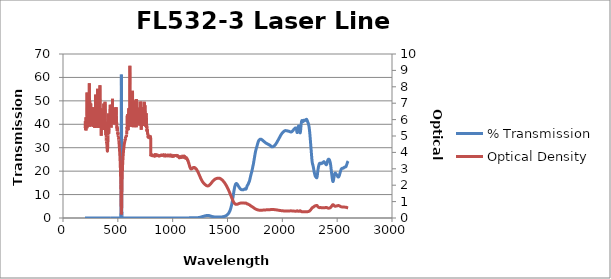
| Category | % Transmission |
|---|---|
| 2600.0 | 24.286 |
| 2599.0 | 24.215 |
| 2598.0 | 24.142 |
| 2597.0 | 24.055 |
| 2596.0 | 23.966 |
| 2595.0 | 23.859 |
| 2594.0 | 23.736 |
| 2593.0 | 23.604 |
| 2592.0 | 23.474 |
| 2591.0 | 23.342 |
| 2590.0 | 23.202 |
| 2589.0 | 23.065 |
| 2588.0 | 22.916 |
| 2587.0 | 22.777 |
| 2586.0 | 22.633 |
| 2585.0 | 22.502 |
| 2584.0 | 22.37 |
| 2583.0 | 22.226 |
| 2582.0 | 22.093 |
| 2581.0 | 21.995 |
| 2580.0 | 21.918 |
| 2579.0 | 21.86 |
| 2578.0 | 21.818 |
| 2577.0 | 21.786 |
| 2576.0 | 21.765 |
| 2575.0 | 21.761 |
| 2574.0 | 21.758 |
| 2573.0 | 21.751 |
| 2572.0 | 21.746 |
| 2571.0 | 21.74 |
| 2570.0 | 21.734 |
| 2569.0 | 21.72 |
| 2568.0 | 21.706 |
| 2567.0 | 21.686 |
| 2566.0 | 21.658 |
| 2565.0 | 21.623 |
| 2564.0 | 21.584 |
| 2563.0 | 21.539 |
| 2562.0 | 21.491 |
| 2561.0 | 21.448 |
| 2560.0 | 21.4 |
| 2559.0 | 21.361 |
| 2558.0 | 21.331 |
| 2557.0 | 21.311 |
| 2556.0 | 21.285 |
| 2555.0 | 21.271 |
| 2554.0 | 21.256 |
| 2553.0 | 21.247 |
| 2552.0 | 21.245 |
| 2551.0 | 21.244 |
| 2550.0 | 21.245 |
| 2549.0 | 21.244 |
| 2548.0 | 21.243 |
| 2547.0 | 21.237 |
| 2546.0 | 21.217 |
| 2545.0 | 21.2 |
| 2544.0 | 21.173 |
| 2543.0 | 21.134 |
| 2542.0 | 21.092 |
| 2541.0 | 21.052 |
| 2540.0 | 20.996 |
| 2539.0 | 20.935 |
| 2538.0 | 20.869 |
| 2537.0 | 20.794 |
| 2536.0 | 20.698 |
| 2535.0 | 20.59 |
| 2534.0 | 20.459 |
| 2533.0 | 20.317 |
| 2532.0 | 20.169 |
| 2531.0 | 20.012 |
| 2530.0 | 19.856 |
| 2529.0 | 19.701 |
| 2528.0 | 19.535 |
| 2527.0 | 19.372 |
| 2526.0 | 19.213 |
| 2525.0 | 19.052 |
| 2524.0 | 18.881 |
| 2523.0 | 18.72 |
| 2522.0 | 18.554 |
| 2521.0 | 18.399 |
| 2520.0 | 18.25 |
| 2519.0 | 18.115 |
| 2518.0 | 17.98 |
| 2517.0 | 17.861 |
| 2516.0 | 17.753 |
| 2515.0 | 17.659 |
| 2514.0 | 17.584 |
| 2513.0 | 17.535 |
| 2512.0 | 17.503 |
| 2511.0 | 17.485 |
| 2510.0 | 17.482 |
| 2509.0 | 17.501 |
| 2508.0 | 17.531 |
| 2507.0 | 17.571 |
| 2506.0 | 17.626 |
| 2505.0 | 17.694 |
| 2504.0 | 17.765 |
| 2503.0 | 17.844 |
| 2502.0 | 17.935 |
| 2501.0 | 18.023 |
| 2500.0 | 18.105 |
| 2499.0 | 18.186 |
| 2498.0 | 18.268 |
| 2497.0 | 18.338 |
| 2496.0 | 18.407 |
| 2495.0 | 18.477 |
| 2494.0 | 18.537 |
| 2493.0 | 18.592 |
| 2492.0 | 18.65 |
| 2491.0 | 18.706 |
| 2490.0 | 18.765 |
| 2489.0 | 18.822 |
| 2488.0 | 18.894 |
| 2487.0 | 18.959 |
| 2486.0 | 19.024 |
| 2485.0 | 19.081 |
| 2484.0 | 19.134 |
| 2483.0 | 19.162 |
| 2482.0 | 19.169 |
| 2481.0 | 19.149 |
| 2480.0 | 19.095 |
| 2479.0 | 19.004 |
| 2478.0 | 18.884 |
| 2477.0 | 18.732 |
| 2476.0 | 18.553 |
| 2475.0 | 18.352 |
| 2474.0 | 18.138 |
| 2473.0 | 17.909 |
| 2472.0 | 17.661 |
| 2471.0 | 17.403 |
| 2470.0 | 17.137 |
| 2469.0 | 16.861 |
| 2468.0 | 16.595 |
| 2467.0 | 16.331 |
| 2466.0 | 16.087 |
| 2465.0 | 15.866 |
| 2464.0 | 15.696 |
| 2463.0 | 15.582 |
| 2462.0 | 15.535 |
| 2461.0 | 15.562 |
| 2460.0 | 15.664 |
| 2459.0 | 15.836 |
| 2458.0 | 16.063 |
| 2457.0 | 16.35 |
| 2456.0 | 16.668 |
| 2455.0 | 16.993 |
| 2454.0 | 17.33 |
| 2453.0 | 17.688 |
| 2452.0 | 18.042 |
| 2451.0 | 18.419 |
| 2450.0 | 18.816 |
| 2449.0 | 19.208 |
| 2448.0 | 19.608 |
| 2447.0 | 20.025 |
| 2446.0 | 20.453 |
| 2445.0 | 20.874 |
| 2444.0 | 21.307 |
| 2443.0 | 21.728 |
| 2442.0 | 22.103 |
| 2441.0 | 22.475 |
| 2440.0 | 22.801 |
| 2439.0 | 23.103 |
| 2438.0 | 23.375 |
| 2437.0 | 23.623 |
| 2436.0 | 23.838 |
| 2435.0 | 24.023 |
| 2434.0 | 24.192 |
| 2433.0 | 24.34 |
| 2432.0 | 24.473 |
| 2431.0 | 24.595 |
| 2430.0 | 24.7 |
| 2429.0 | 24.792 |
| 2428.0 | 24.879 |
| 2427.0 | 24.953 |
| 2426.0 | 25.008 |
| 2425.0 | 25.056 |
| 2424.0 | 25.087 |
| 2423.0 | 25.095 |
| 2422.0 | 25.1 |
| 2421.0 | 25.086 |
| 2420.0 | 25.055 |
| 2419.0 | 25.021 |
| 2418.0 | 24.963 |
| 2417.0 | 24.891 |
| 2416.0 | 24.819 |
| 2415.0 | 24.716 |
| 2414.0 | 24.6 |
| 2413.0 | 24.471 |
| 2412.0 | 24.306 |
| 2411.0 | 24.136 |
| 2410.0 | 23.947 |
| 2409.0 | 23.754 |
| 2408.0 | 23.558 |
| 2407.0 | 23.362 |
| 2406.0 | 23.182 |
| 2405.0 | 23.023 |
| 2404.0 | 22.891 |
| 2403.0 | 22.801 |
| 2402.0 | 22.747 |
| 2401.0 | 22.725 |
| 2400.0 | 22.737 |
| 2399.0 | 22.773 |
| 2398.0 | 22.831 |
| 2397.0 | 22.895 |
| 2396.0 | 22.967 |
| 2395.0 | 23.048 |
| 2394.0 | 23.116 |
| 2393.0 | 23.188 |
| 2392.0 | 23.257 |
| 2391.0 | 23.32 |
| 2390.0 | 23.389 |
| 2389.0 | 23.456 |
| 2388.0 | 23.523 |
| 2387.0 | 23.6 |
| 2386.0 | 23.67 |
| 2385.0 | 23.748 |
| 2384.0 | 23.819 |
| 2383.0 | 23.879 |
| 2382.0 | 23.942 |
| 2381.0 | 23.985 |
| 2380.0 | 24.015 |
| 2379.0 | 24.032 |
| 2378.0 | 24.024 |
| 2377.0 | 23.996 |
| 2376.0 | 23.965 |
| 2375.0 | 23.906 |
| 2374.0 | 23.857 |
| 2373.0 | 23.791 |
| 2372.0 | 23.721 |
| 2371.0 | 23.667 |
| 2370.0 | 23.6 |
| 2369.0 | 23.549 |
| 2368.0 | 23.496 |
| 2367.0 | 23.446 |
| 2366.0 | 23.399 |
| 2365.0 | 23.374 |
| 2364.0 | 23.36 |
| 2363.0 | 23.365 |
| 2362.0 | 23.384 |
| 2361.0 | 23.412 |
| 2360.0 | 23.438 |
| 2359.0 | 23.45 |
| 2358.0 | 23.453 |
| 2357.0 | 23.431 |
| 2356.0 | 23.399 |
| 2355.0 | 23.343 |
| 2354.0 | 23.285 |
| 2353.0 | 23.222 |
| 2352.0 | 23.174 |
| 2351.0 | 23.142 |
| 2350.0 | 23.132 |
| 2349.0 | 23.143 |
| 2348.0 | 23.17 |
| 2347.0 | 23.212 |
| 2346.0 | 23.253 |
| 2345.0 | 23.291 |
| 2344.0 | 23.322 |
| 2343.0 | 23.344 |
| 2342.0 | 23.351 |
| 2341.0 | 23.346 |
| 2340.0 | 23.317 |
| 2339.0 | 23.262 |
| 2338.0 | 23.198 |
| 2337.0 | 23.1 |
| 2336.0 | 22.987 |
| 2335.0 | 22.847 |
| 2334.0 | 22.687 |
| 2333.0 | 22.502 |
| 2332.0 | 22.314 |
| 2331.0 | 22.106 |
| 2330.0 | 21.885 |
| 2329.0 | 21.659 |
| 2328.0 | 21.408 |
| 2327.0 | 21.138 |
| 2326.0 | 20.86 |
| 2325.0 | 20.544 |
| 2324.0 | 20.218 |
| 2323.0 | 19.845 |
| 2322.0 | 19.453 |
| 2321.0 | 19.03 |
| 2320.0 | 18.616 |
| 2319.0 | 18.234 |
| 2318.0 | 17.887 |
| 2317.0 | 17.598 |
| 2316.0 | 17.385 |
| 2315.0 | 17.236 |
| 2314.0 | 17.157 |
| 2313.0 | 17.137 |
| 2312.0 | 17.163 |
| 2311.0 | 17.22 |
| 2310.0 | 17.292 |
| 2309.0 | 17.372 |
| 2308.0 | 17.448 |
| 2307.0 | 17.511 |
| 2306.0 | 17.561 |
| 2305.0 | 17.6 |
| 2304.0 | 17.645 |
| 2303.0 | 17.689 |
| 2302.0 | 17.747 |
| 2301.0 | 17.831 |
| 2300.0 | 17.921 |
| 2299.0 | 18.049 |
| 2298.0 | 18.19 |
| 2297.0 | 18.353 |
| 2296.0 | 18.536 |
| 2295.0 | 18.733 |
| 2294.0 | 18.934 |
| 2293.0 | 19.14 |
| 2292.0 | 19.363 |
| 2291.0 | 19.582 |
| 2290.0 | 19.817 |
| 2289.0 | 20.072 |
| 2288.0 | 20.323 |
| 2287.0 | 20.584 |
| 2286.0 | 20.855 |
| 2285.0 | 21.125 |
| 2284.0 | 21.387 |
| 2283.0 | 21.655 |
| 2282.0 | 21.906 |
| 2281.0 | 22.126 |
| 2280.0 | 22.329 |
| 2279.0 | 22.512 |
| 2278.0 | 22.676 |
| 2277.0 | 22.836 |
| 2276.0 | 23.008 |
| 2275.0 | 23.201 |
| 2274.0 | 23.416 |
| 2273.0 | 23.69 |
| 2272.0 | 24.014 |
| 2271.0 | 24.4 |
| 2270.0 | 24.86 |
| 2269.0 | 25.366 |
| 2268.0 | 25.901 |
| 2267.0 | 26.466 |
| 2266.0 | 27.045 |
| 2265.0 | 27.63 |
| 2264.0 | 28.234 |
| 2263.0 | 28.856 |
| 2262.0 | 29.456 |
| 2261.0 | 30.047 |
| 2260.0 | 30.636 |
| 2259.0 | 31.23 |
| 2258.0 | 31.807 |
| 2257.0 | 32.426 |
| 2256.0 | 33.023 |
| 2255.0 | 33.597 |
| 2254.0 | 34.18 |
| 2253.0 | 34.742 |
| 2252.0 | 35.284 |
| 2251.0 | 35.826 |
| 2250.0 | 36.346 |
| 2249.0 | 36.825 |
| 2248.0 | 37.276 |
| 2247.0 | 37.699 |
| 2246.0 | 38.093 |
| 2245.0 | 38.454 |
| 2244.0 | 38.798 |
| 2243.0 | 39.099 |
| 2242.0 | 39.369 |
| 2241.0 | 39.609 |
| 2240.0 | 39.823 |
| 2239.0 | 40.01 |
| 2238.0 | 40.178 |
| 2237.0 | 40.326 |
| 2236.0 | 40.453 |
| 2235.0 | 40.574 |
| 2234.0 | 40.681 |
| 2233.0 | 40.796 |
| 2232.0 | 40.908 |
| 2231.0 | 41.035 |
| 2230.0 | 41.161 |
| 2229.0 | 41.291 |
| 2228.0 | 41.435 |
| 2227.0 | 41.564 |
| 2226.0 | 41.692 |
| 2225.0 | 41.817 |
| 2224.0 | 41.914 |
| 2223.0 | 41.998 |
| 2222.0 | 42.066 |
| 2221.0 | 42.101 |
| 2220.0 | 42.121 |
| 2219.0 | 42.121 |
| 2218.0 | 42.094 |
| 2217.0 | 42.059 |
| 2216.0 | 42.012 |
| 2215.0 | 41.948 |
| 2214.0 | 41.894 |
| 2213.0 | 41.826 |
| 2212.0 | 41.77 |
| 2211.0 | 41.725 |
| 2210.0 | 41.676 |
| 2209.0 | 41.66 |
| 2208.0 | 41.647 |
| 2207.0 | 41.642 |
| 2206.0 | 41.661 |
| 2205.0 | 41.674 |
| 2204.0 | 41.691 |
| 2203.0 | 41.729 |
| 2202.0 | 41.744 |
| 2201.0 | 41.764 |
| 2200.0 | 41.777 |
| 2199.0 | 41.763 |
| 2198.0 | 41.749 |
| 2197.0 | 41.703 |
| 2196.0 | 41.644 |
| 2195.0 | 41.577 |
| 2194.0 | 41.483 |
| 2193.0 | 41.398 |
| 2192.0 | 41.314 |
| 2191.0 | 41.24 |
| 2190.0 | 41.194 |
| 2189.0 | 41.173 |
| 2188.0 | 41.175 |
| 2187.0 | 41.22 |
| 2186.0 | 41.277 |
| 2185.0 | 41.356 |
| 2184.0 | 41.443 |
| 2183.0 | 41.512 |
| 2182.0 | 41.573 |
| 2181.0 | 41.614 |
| 2180.0 | 41.623 |
| 2179.0 | 41.602 |
| 2178.0 | 41.547 |
| 2177.0 | 41.452 |
| 2176.0 | 41.308 |
| 2175.0 | 41.12 |
| 2174.0 | 40.869 |
| 2173.0 | 40.552 |
| 2172.0 | 40.17 |
| 2171.0 | 39.726 |
| 2170.0 | 39.226 |
| 2169.0 | 38.675 |
| 2168.0 | 38.137 |
| 2167.0 | 37.592 |
| 2166.0 | 37.112 |
| 2165.0 | 36.749 |
| 2164.0 | 36.482 |
| 2163.0 | 36.353 |
| 2162.0 | 36.343 |
| 2161.0 | 36.455 |
| 2160.0 | 36.669 |
| 2159.0 | 36.955 |
| 2158.0 | 37.27 |
| 2157.0 | 37.623 |
| 2156.0 | 37.973 |
| 2155.0 | 38.303 |
| 2154.0 | 38.615 |
| 2153.0 | 38.867 |
| 2152.0 | 39.066 |
| 2151.0 | 39.209 |
| 2150.0 | 39.29 |
| 2149.0 | 39.317 |
| 2148.0 | 39.274 |
| 2147.0 | 39.177 |
| 2146.0 | 39.027 |
| 2145.0 | 38.819 |
| 2144.0 | 38.575 |
| 2143.0 | 38.288 |
| 2142.0 | 37.982 |
| 2141.0 | 37.646 |
| 2140.0 | 37.318 |
| 2139.0 | 37.031 |
| 2138.0 | 36.777 |
| 2137.0 | 36.585 |
| 2136.0 | 36.48 |
| 2135.0 | 36.463 |
| 2134.0 | 36.536 |
| 2133.0 | 36.706 |
| 2132.0 | 36.919 |
| 2131.0 | 37.183 |
| 2130.0 | 37.455 |
| 2129.0 | 37.712 |
| 2128.0 | 37.951 |
| 2127.0 | 38.133 |
| 2126.0 | 38.267 |
| 2125.0 | 38.357 |
| 2124.0 | 38.408 |
| 2123.0 | 38.429 |
| 2122.0 | 38.434 |
| 2121.0 | 38.428 |
| 2120.0 | 38.416 |
| 2119.0 | 38.398 |
| 2118.0 | 38.386 |
| 2117.0 | 38.363 |
| 2116.0 | 38.337 |
| 2115.0 | 38.301 |
| 2114.0 | 38.259 |
| 2113.0 | 38.212 |
| 2112.0 | 38.161 |
| 2111.0 | 38.111 |
| 2110.0 | 38.061 |
| 2109.0 | 38.011 |
| 2108.0 | 37.962 |
| 2107.0 | 37.914 |
| 2106.0 | 37.866 |
| 2105.0 | 37.818 |
| 2104.0 | 37.766 |
| 2103.0 | 37.706 |
| 2102.0 | 37.65 |
| 2101.0 | 37.587 |
| 2100.0 | 37.52 |
| 2099.0 | 37.459 |
| 2098.0 | 37.39 |
| 2097.0 | 37.325 |
| 2096.0 | 37.258 |
| 2095.0 | 37.202 |
| 2094.0 | 37.15 |
| 2093.0 | 37.092 |
| 2092.0 | 37.053 |
| 2091.0 | 37.011 |
| 2090.0 | 36.969 |
| 2089.0 | 36.934 |
| 2088.0 | 36.896 |
| 2087.0 | 36.864 |
| 2086.0 | 36.828 |
| 2085.0 | 36.803 |
| 2084.0 | 36.776 |
| 2083.0 | 36.747 |
| 2082.0 | 36.733 |
| 2081.0 | 36.712 |
| 2080.0 | 36.703 |
| 2079.0 | 36.705 |
| 2078.0 | 36.704 |
| 2077.0 | 36.711 |
| 2076.0 | 36.724 |
| 2075.0 | 36.741 |
| 2074.0 | 36.757 |
| 2073.0 | 36.773 |
| 2072.0 | 36.796 |
| 2071.0 | 36.809 |
| 2070.0 | 36.826 |
| 2069.0 | 36.84 |
| 2068.0 | 36.858 |
| 2067.0 | 36.869 |
| 2066.0 | 36.881 |
| 2065.0 | 36.901 |
| 2064.0 | 36.921 |
| 2063.0 | 36.938 |
| 2062.0 | 36.962 |
| 2061.0 | 36.983 |
| 2060.0 | 37.007 |
| 2059.0 | 37.028 |
| 2058.0 | 37.045 |
| 2057.0 | 37.064 |
| 2056.0 | 37.073 |
| 2055.0 | 37.084 |
| 2054.0 | 37.09 |
| 2053.0 | 37.093 |
| 2052.0 | 37.097 |
| 2051.0 | 37.104 |
| 2050.0 | 37.115 |
| 2049.0 | 37.126 |
| 2048.0 | 37.138 |
| 2047.0 | 37.147 |
| 2046.0 | 37.167 |
| 2045.0 | 37.18 |
| 2044.0 | 37.193 |
| 2043.0 | 37.207 |
| 2042.0 | 37.218 |
| 2041.0 | 37.227 |
| 2040.0 | 37.231 |
| 2039.0 | 37.239 |
| 2038.0 | 37.246 |
| 2037.0 | 37.246 |
| 2036.0 | 37.258 |
| 2035.0 | 37.261 |
| 2034.0 | 37.271 |
| 2033.0 | 37.281 |
| 2032.0 | 37.291 |
| 2031.0 | 37.304 |
| 2030.0 | 37.303 |
| 2029.0 | 37.308 |
| 2028.0 | 37.301 |
| 2027.0 | 37.297 |
| 2026.0 | 37.279 |
| 2025.0 | 37.265 |
| 2024.0 | 37.246 |
| 2023.0 | 37.217 |
| 2022.0 | 37.194 |
| 2021.0 | 37.166 |
| 2020.0 | 37.151 |
| 2019.0 | 37.12 |
| 2018.0 | 37.09 |
| 2017.0 | 37.064 |
| 2016.0 | 37.041 |
| 2015.0 | 37.014 |
| 2014.0 | 36.976 |
| 2013.0 | 36.937 |
| 2012.0 | 36.898 |
| 2011.0 | 36.855 |
| 2010.0 | 36.805 |
| 2009.0 | 36.761 |
| 2008.0 | 36.712 |
| 2007.0 | 36.661 |
| 2006.0 | 36.616 |
| 2005.0 | 36.574 |
| 2004.0 | 36.535 |
| 2003.0 | 36.487 |
| 2002.0 | 36.437 |
| 2001.0 | 36.392 |
| 2000.0 | 36.338 |
| 1999.0 | 36.29 |
| 1998.0 | 36.22 |
| 1997.0 | 36.154 |
| 1996.0 | 36.088 |
| 1995.0 | 36.006 |
| 1994.0 | 35.934 |
| 1993.0 | 35.856 |
| 1992.0 | 35.794 |
| 1991.0 | 35.727 |
| 1990.0 | 35.66 |
| 1989.0 | 35.588 |
| 1988.0 | 35.522 |
| 1987.0 | 35.46 |
| 1986.0 | 35.378 |
| 1985.0 | 35.297 |
| 1984.0 | 35.209 |
| 1983.0 | 35.128 |
| 1982.0 | 35.036 |
| 1981.0 | 34.939 |
| 1980.0 | 34.842 |
| 1979.0 | 34.752 |
| 1978.0 | 34.666 |
| 1977.0 | 34.58 |
| 1976.0 | 34.489 |
| 1975.0 | 34.411 |
| 1974.0 | 34.331 |
| 1973.0 | 34.244 |
| 1972.0 | 34.155 |
| 1971.0 | 34.062 |
| 1970.0 | 33.972 |
| 1969.0 | 33.888 |
| 1968.0 | 33.79 |
| 1967.0 | 33.692 |
| 1966.0 | 33.6 |
| 1965.0 | 33.518 |
| 1964.0 | 33.437 |
| 1963.0 | 33.355 |
| 1962.0 | 33.273 |
| 1961.0 | 33.19 |
| 1960.0 | 33.118 |
| 1959.0 | 33.046 |
| 1958.0 | 32.961 |
| 1957.0 | 32.868 |
| 1956.0 | 32.789 |
| 1955.0 | 32.7 |
| 1954.0 | 32.613 |
| 1953.0 | 32.517 |
| 1952.0 | 32.433 |
| 1951.0 | 32.356 |
| 1950.0 | 32.288 |
| 1949.0 | 32.21 |
| 1948.0 | 32.131 |
| 1947.0 | 32.059 |
| 1946.0 | 31.992 |
| 1945.0 | 31.925 |
| 1944.0 | 31.845 |
| 1943.0 | 31.763 |
| 1942.0 | 31.677 |
| 1941.0 | 31.601 |
| 1940.0 | 31.528 |
| 1939.0 | 31.451 |
| 1938.0 | 31.378 |
| 1937.0 | 31.314 |
| 1936.0 | 31.268 |
| 1935.0 | 31.218 |
| 1934.0 | 31.17 |
| 1933.0 | 31.119 |
| 1932.0 | 31.066 |
| 1931.0 | 31.012 |
| 1930.0 | 30.967 |
| 1929.0 | 30.909 |
| 1928.0 | 30.856 |
| 1927.0 | 30.794 |
| 1926.0 | 30.75 |
| 1925.0 | 30.707 |
| 1924.0 | 30.688 |
| 1923.0 | 30.657 |
| 1922.0 | 30.621 |
| 1921.0 | 30.578 |
| 1920.0 | 30.549 |
| 1919.0 | 30.522 |
| 1918.0 | 30.504 |
| 1917.0 | 30.487 |
| 1916.0 | 30.457 |
| 1915.0 | 30.421 |
| 1914.0 | 30.395 |
| 1913.0 | 30.373 |
| 1912.0 | 30.365 |
| 1911.0 | 30.36 |
| 1910.0 | 30.361 |
| 1909.0 | 30.357 |
| 1908.0 | 30.364 |
| 1907.0 | 30.369 |
| 1906.0 | 30.38 |
| 1905.0 | 30.375 |
| 1904.0 | 30.378 |
| 1903.0 | 30.387 |
| 1902.0 | 30.41 |
| 1901.0 | 30.443 |
| 1900.0 | 30.477 |
| 1899.0 | 30.528 |
| 1898.0 | 30.566 |
| 1897.0 | 30.615 |
| 1896.0 | 30.651 |
| 1895.0 | 30.698 |
| 1894.0 | 30.748 |
| 1893.0 | 30.792 |
| 1892.0 | 30.828 |
| 1891.0 | 30.871 |
| 1890.0 | 30.91 |
| 1889.0 | 30.952 |
| 1888.0 | 30.99 |
| 1887.0 | 31.032 |
| 1886.0 | 31.068 |
| 1885.0 | 31.1 |
| 1884.0 | 31.124 |
| 1883.0 | 31.156 |
| 1882.0 | 31.188 |
| 1881.0 | 31.229 |
| 1880.0 | 31.253 |
| 1879.0 | 31.258 |
| 1878.0 | 31.264 |
| 1877.0 | 31.271 |
| 1876.0 | 31.302 |
| 1875.0 | 31.339 |
| 1874.0 | 31.377 |
| 1873.0 | 31.411 |
| 1872.0 | 31.438 |
| 1871.0 | 31.462 |
| 1870.0 | 31.492 |
| 1869.0 | 31.511 |
| 1868.0 | 31.54 |
| 1867.0 | 31.558 |
| 1866.0 | 31.572 |
| 1865.0 | 31.589 |
| 1864.0 | 31.611 |
| 1863.0 | 31.636 |
| 1862.0 | 31.66 |
| 1861.0 | 31.679 |
| 1860.0 | 31.712 |
| 1859.0 | 31.741 |
| 1858.0 | 31.785 |
| 1857.0 | 31.821 |
| 1856.0 | 31.857 |
| 1855.0 | 31.874 |
| 1854.0 | 31.884 |
| 1853.0 | 31.905 |
| 1852.0 | 31.938 |
| 1851.0 | 31.972 |
| 1850.0 | 32.004 |
| 1849.0 | 32.038 |
| 1848.0 | 32.083 |
| 1847.0 | 32.13 |
| 1846.0 | 32.169 |
| 1845.0 | 32.206 |
| 1844.0 | 32.233 |
| 1843.0 | 32.266 |
| 1842.0 | 32.302 |
| 1841.0 | 32.339 |
| 1840.0 | 32.387 |
| 1839.0 | 32.432 |
| 1838.0 | 32.466 |
| 1837.0 | 32.494 |
| 1836.0 | 32.516 |
| 1835.0 | 32.554 |
| 1834.0 | 32.598 |
| 1833.0 | 32.65 |
| 1832.0 | 32.703 |
| 1831.0 | 32.75 |
| 1830.0 | 32.792 |
| 1829.0 | 32.82 |
| 1828.0 | 32.84 |
| 1827.0 | 32.858 |
| 1826.0 | 32.892 |
| 1825.0 | 32.946 |
| 1824.0 | 33.001 |
| 1823.0 | 33.052 |
| 1822.0 | 33.096 |
| 1821.0 | 33.159 |
| 1820.0 | 33.21 |
| 1819.0 | 33.248 |
| 1818.0 | 33.275 |
| 1817.0 | 33.311 |
| 1816.0 | 33.34 |
| 1815.0 | 33.371 |
| 1814.0 | 33.409 |
| 1813.0 | 33.436 |
| 1812.0 | 33.47 |
| 1811.0 | 33.496 |
| 1810.0 | 33.525 |
| 1809.0 | 33.554 |
| 1808.0 | 33.578 |
| 1807.0 | 33.595 |
| 1806.0 | 33.605 |
| 1805.0 | 33.615 |
| 1804.0 | 33.615 |
| 1803.0 | 33.627 |
| 1802.0 | 33.627 |
| 1801.0 | 33.638 |
| 1800.0 | 33.643 |
| 1799.0 | 33.638 |
| 1798.0 | 33.635 |
| 1797.0 | 33.612 |
| 1796.0 | 33.596 |
| 1795.0 | 33.555 |
| 1794.0 | 33.522 |
| 1793.0 | 33.481 |
| 1792.0 | 33.435 |
| 1791.0 | 33.401 |
| 1790.0 | 33.349 |
| 1789.0 | 33.305 |
| 1788.0 | 33.249 |
| 1787.0 | 33.184 |
| 1786.0 | 33.117 |
| 1785.0 | 33.03 |
| 1784.0 | 32.944 |
| 1783.0 | 32.838 |
| 1782.0 | 32.727 |
| 1781.0 | 32.608 |
| 1780.0 | 32.487 |
| 1779.0 | 32.358 |
| 1778.0 | 32.216 |
| 1777.0 | 32.072 |
| 1776.0 | 31.919 |
| 1775.0 | 31.754 |
| 1774.0 | 31.58 |
| 1773.0 | 31.405 |
| 1772.0 | 31.222 |
| 1771.0 | 31.042 |
| 1770.0 | 30.874 |
| 1769.0 | 30.704 |
| 1768.0 | 30.539 |
| 1767.0 | 30.386 |
| 1766.0 | 30.238 |
| 1765.0 | 30.087 |
| 1764.0 | 29.933 |
| 1763.0 | 29.767 |
| 1762.0 | 29.589 |
| 1761.0 | 29.411 |
| 1760.0 | 29.233 |
| 1759.0 | 29.044 |
| 1758.0 | 28.85 |
| 1757.0 | 28.651 |
| 1756.0 | 28.439 |
| 1755.0 | 28.211 |
| 1754.0 | 27.983 |
| 1753.0 | 27.74 |
| 1752.0 | 27.474 |
| 1751.0 | 27.222 |
| 1750.0 | 26.946 |
| 1749.0 | 26.665 |
| 1748.0 | 26.394 |
| 1747.0 | 26.117 |
| 1746.0 | 25.837 |
| 1745.0 | 25.545 |
| 1744.0 | 25.256 |
| 1743.0 | 24.953 |
| 1742.0 | 24.651 |
| 1741.0 | 24.371 |
| 1740.0 | 24.084 |
| 1739.0 | 23.816 |
| 1738.0 | 23.554 |
| 1737.0 | 23.29 |
| 1736.0 | 23.043 |
| 1735.0 | 22.809 |
| 1734.0 | 22.581 |
| 1733.0 | 22.361 |
| 1732.0 | 22.147 |
| 1731.0 | 21.927 |
| 1730.0 | 21.707 |
| 1729.0 | 21.487 |
| 1728.0 | 21.268 |
| 1727.0 | 21.039 |
| 1726.0 | 20.81 |
| 1725.0 | 20.589 |
| 1724.0 | 20.352 |
| 1723.0 | 20.127 |
| 1722.0 | 19.932 |
| 1721.0 | 19.73 |
| 1720.0 | 19.542 |
| 1719.0 | 19.359 |
| 1718.0 | 19.188 |
| 1717.0 | 19.014 |
| 1716.0 | 18.846 |
| 1715.0 | 18.682 |
| 1714.0 | 18.511 |
| 1713.0 | 18.328 |
| 1712.0 | 18.141 |
| 1711.0 | 17.94 |
| 1710.0 | 17.739 |
| 1709.0 | 17.533 |
| 1708.0 | 17.324 |
| 1707.0 | 17.11 |
| 1706.0 | 16.913 |
| 1705.0 | 16.699 |
| 1704.0 | 16.492 |
| 1703.0 | 16.294 |
| 1702.0 | 16.104 |
| 1701.0 | 15.927 |
| 1700.0 | 15.768 |
| 1699.0 | 15.629 |
| 1698.0 | 15.517 |
| 1697.0 | 15.416 |
| 1696.0 | 15.325 |
| 1695.0 | 15.231 |
| 1694.0 | 15.125 |
| 1693.0 | 15 |
| 1692.0 | 14.861 |
| 1691.0 | 14.716 |
| 1690.0 | 14.58 |
| 1689.0 | 14.457 |
| 1688.0 | 14.353 |
| 1687.0 | 14.273 |
| 1686.0 | 14.206 |
| 1685.0 | 14.154 |
| 1684.0 | 14.112 |
| 1683.0 | 14.059 |
| 1682.0 | 14 |
| 1681.0 | 13.924 |
| 1680.0 | 13.828 |
| 1679.0 | 13.707 |
| 1678.0 | 13.562 |
| 1677.0 | 13.418 |
| 1676.0 | 13.254 |
| 1675.0 | 13.094 |
| 1674.0 | 12.926 |
| 1673.0 | 12.775 |
| 1672.0 | 12.637 |
| 1671.0 | 12.521 |
| 1670.0 | 12.422 |
| 1669.0 | 12.351 |
| 1668.0 | 12.31 |
| 1667.0 | 12.297 |
| 1666.0 | 12.301 |
| 1665.0 | 12.324 |
| 1664.0 | 12.358 |
| 1663.0 | 12.387 |
| 1662.0 | 12.415 |
| 1661.0 | 12.436 |
| 1660.0 | 12.447 |
| 1659.0 | 12.445 |
| 1658.0 | 12.442 |
| 1657.0 | 12.427 |
| 1656.0 | 12.403 |
| 1655.0 | 12.377 |
| 1654.0 | 12.346 |
| 1653.0 | 12.311 |
| 1652.0 | 12.276 |
| 1651.0 | 12.236 |
| 1650.0 | 12.198 |
| 1649.0 | 12.163 |
| 1648.0 | 12.131 |
| 1647.0 | 12.105 |
| 1646.0 | 12.087 |
| 1645.0 | 12.079 |
| 1644.0 | 12.066 |
| 1643.0 | 12.068 |
| 1642.0 | 12.067 |
| 1641.0 | 12.064 |
| 1640.0 | 12.057 |
| 1639.0 | 12.052 |
| 1638.0 | 12.043 |
| 1637.0 | 12.032 |
| 1636.0 | 12.023 |
| 1635.0 | 12.021 |
| 1634.0 | 12.018 |
| 1633.0 | 12.027 |
| 1632.0 | 12.035 |
| 1631.0 | 12.051 |
| 1630.0 | 12.067 |
| 1629.0 | 12.085 |
| 1628.0 | 12.095 |
| 1627.0 | 12.117 |
| 1626.0 | 12.14 |
| 1625.0 | 12.162 |
| 1624.0 | 12.184 |
| 1623.0 | 12.209 |
| 1622.0 | 12.237 |
| 1621.0 | 12.268 |
| 1620.0 | 12.303 |
| 1619.0 | 12.339 |
| 1618.0 | 12.377 |
| 1617.0 | 12.424 |
| 1616.0 | 12.467 |
| 1615.0 | 12.521 |
| 1614.0 | 12.583 |
| 1613.0 | 12.64 |
| 1612.0 | 12.703 |
| 1611.0 | 12.763 |
| 1610.0 | 12.822 |
| 1609.0 | 12.884 |
| 1608.0 | 12.955 |
| 1607.0 | 13.019 |
| 1606.0 | 13.089 |
| 1605.0 | 13.165 |
| 1604.0 | 13.241 |
| 1603.0 | 13.315 |
| 1602.0 | 13.401 |
| 1601.0 | 13.476 |
| 1600.0 | 13.555 |
| 1599.0 | 13.632 |
| 1598.0 | 13.713 |
| 1597.0 | 13.794 |
| 1596.0 | 13.878 |
| 1595.0 | 13.965 |
| 1594.0 | 14.039 |
| 1593.0 | 14.12 |
| 1592.0 | 14.194 |
| 1591.0 | 14.266 |
| 1590.0 | 14.333 |
| 1589.0 | 14.399 |
| 1588.0 | 14.461 |
| 1587.0 | 14.516 |
| 1586.0 | 14.573 |
| 1585.0 | 14.619 |
| 1584.0 | 14.653 |
| 1583.0 | 14.68 |
| 1582.0 | 14.697 |
| 1581.0 | 14.708 |
| 1580.0 | 14.702 |
| 1579.0 | 14.695 |
| 1578.0 | 14.676 |
| 1577.0 | 14.639 |
| 1576.0 | 14.589 |
| 1575.0 | 14.528 |
| 1574.0 | 14.446 |
| 1573.0 | 14.352 |
| 1572.0 | 14.245 |
| 1571.0 | 14.12 |
| 1570.0 | 13.98 |
| 1569.0 | 13.826 |
| 1568.0 | 13.664 |
| 1567.0 | 13.48 |
| 1566.0 | 13.283 |
| 1565.0 | 13.072 |
| 1564.0 | 12.84 |
| 1563.0 | 12.597 |
| 1562.0 | 12.352 |
| 1561.0 | 12.099 |
| 1560.0 | 11.833 |
| 1559.0 | 11.558 |
| 1558.0 | 11.273 |
| 1557.0 | 10.969 |
| 1556.0 | 10.68 |
| 1555.0 | 10.378 |
| 1554.0 | 10.078 |
| 1553.0 | 9.776 |
| 1552.0 | 9.479 |
| 1551.0 | 9.171 |
| 1550.0 | 8.865 |
| 1549.0 | 8.582 |
| 1548.0 | 8.283 |
| 1547.0 | 7.994 |
| 1546.0 | 7.718 |
| 1545.0 | 7.432 |
| 1544.0 | 7.163 |
| 1543.0 | 6.899 |
| 1542.0 | 6.652 |
| 1541.0 | 6.404 |
| 1540.0 | 6.171 |
| 1539.0 | 5.936 |
| 1538.0 | 5.705 |
| 1537.0 | 5.489 |
| 1536.0 | 5.284 |
| 1535.0 | 5.089 |
| 1534.0 | 4.89 |
| 1533.0 | 4.71 |
| 1532.0 | 4.526 |
| 1531.0 | 4.35 |
| 1530.0 | 4.194 |
| 1529.0 | 4.034 |
| 1528.0 | 3.883 |
| 1527.0 | 3.738 |
| 1526.0 | 3.596 |
| 1525.0 | 3.461 |
| 1524.0 | 3.333 |
| 1523.0 | 3.21 |
| 1522.0 | 3.094 |
| 1521.0 | 2.979 |
| 1520.0 | 2.874 |
| 1519.0 | 2.768 |
| 1518.0 | 2.669 |
| 1517.0 | 2.572 |
| 1516.0 | 2.482 |
| 1515.0 | 2.394 |
| 1514.0 | 2.31 |
| 1513.0 | 2.23 |
| 1512.0 | 2.151 |
| 1511.0 | 2.079 |
| 1510.0 | 2.007 |
| 1509.0 | 1.942 |
| 1508.0 | 1.877 |
| 1507.0 | 1.816 |
| 1506.0 | 1.754 |
| 1505.0 | 1.697 |
| 1504.0 | 1.645 |
| 1503.0 | 1.589 |
| 1502.0 | 1.54 |
| 1501.0 | 1.494 |
| 1500.0 | 1.445 |
| 1499.0 | 1.399 |
| 1498.0 | 1.36 |
| 1497.0 | 1.321 |
| 1496.0 | 1.283 |
| 1495.0 | 1.244 |
| 1494.0 | 1.209 |
| 1493.0 | 1.173 |
| 1492.0 | 1.14 |
| 1491.0 | 1.108 |
| 1490.0 | 1.076 |
| 1489.0 | 1.049 |
| 1488.0 | 1.02 |
| 1487.0 | 0.993 |
| 1486.0 | 0.968 |
| 1485.0 | 0.944 |
| 1484.0 | 0.92 |
| 1483.0 | 0.897 |
| 1482.0 | 0.874 |
| 1481.0 | 0.851 |
| 1480.0 | 0.833 |
| 1479.0 | 0.811 |
| 1478.0 | 0.794 |
| 1477.0 | 0.775 |
| 1476.0 | 0.758 |
| 1475.0 | 0.741 |
| 1474.0 | 0.724 |
| 1473.0 | 0.71 |
| 1472.0 | 0.696 |
| 1471.0 | 0.68 |
| 1470.0 | 0.664 |
| 1469.0 | 0.652 |
| 1468.0 | 0.641 |
| 1467.0 | 0.629 |
| 1466.0 | 0.615 |
| 1465.0 | 0.603 |
| 1464.0 | 0.595 |
| 1463.0 | 0.582 |
| 1462.0 | 0.572 |
| 1461.0 | 0.562 |
| 1460.0 | 0.552 |
| 1459.0 | 0.542 |
| 1458.0 | 0.531 |
| 1457.0 | 0.526 |
| 1456.0 | 0.517 |
| 1455.0 | 0.51 |
| 1454.0 | 0.501 |
| 1453.0 | 0.496 |
| 1452.0 | 0.486 |
| 1451.0 | 0.48 |
| 1450.0 | 0.471 |
| 1449.0 | 0.465 |
| 1448.0 | 0.459 |
| 1447.0 | 0.456 |
| 1446.0 | 0.45 |
| 1445.0 | 0.442 |
| 1444.0 | 0.436 |
| 1443.0 | 0.434 |
| 1442.0 | 0.426 |
| 1441.0 | 0.424 |
| 1440.0 | 0.422 |
| 1439.0 | 0.415 |
| 1438.0 | 0.411 |
| 1437.0 | 0.406 |
| 1436.0 | 0.4 |
| 1435.0 | 0.4 |
| 1434.0 | 0.395 |
| 1433.0 | 0.391 |
| 1432.0 | 0.39 |
| 1431.0 | 0.388 |
| 1430.0 | 0.381 |
| 1429.0 | 0.382 |
| 1428.0 | 0.381 |
| 1427.0 | 0.377 |
| 1426.0 | 0.378 |
| 1425.0 | 0.378 |
| 1424.0 | 0.377 |
| 1423.0 | 0.378 |
| 1422.0 | 0.375 |
| 1421.0 | 0.376 |
| 1420.0 | 0.375 |
| 1419.0 | 0.376 |
| 1418.0 | 0.377 |
| 1417.0 | 0.372 |
| 1416.0 | 0.375 |
| 1415.0 | 0.378 |
| 1414.0 | 0.375 |
| 1413.0 | 0.376 |
| 1412.0 | 0.376 |
| 1411.0 | 0.376 |
| 1410.0 | 0.377 |
| 1409.0 | 0.38 |
| 1408.0 | 0.378 |
| 1407.0 | 0.38 |
| 1406.0 | 0.383 |
| 1405.0 | 0.384 |
| 1404.0 | 0.385 |
| 1403.0 | 0.387 |
| 1402.0 | 0.388 |
| 1401.0 | 0.391 |
| 1400.0 | 0.39 |
| 1399.0 | 0.392 |
| 1398.0 | 0.395 |
| 1397.0 | 0.398 |
| 1396.0 | 0.401 |
| 1395.0 | 0.402 |
| 1394.0 | 0.405 |
| 1393.0 | 0.407 |
| 1392.0 | 0.413 |
| 1391.0 | 0.415 |
| 1390.0 | 0.416 |
| 1389.0 | 0.419 |
| 1388.0 | 0.426 |
| 1387.0 | 0.43 |
| 1386.0 | 0.433 |
| 1385.0 | 0.438 |
| 1384.0 | 0.443 |
| 1383.0 | 0.448 |
| 1382.0 | 0.452 |
| 1381.0 | 0.458 |
| 1380.0 | 0.462 |
| 1379.0 | 0.468 |
| 1378.0 | 0.478 |
| 1377.0 | 0.482 |
| 1376.0 | 0.489 |
| 1375.0 | 0.496 |
| 1374.0 | 0.504 |
| 1373.0 | 0.508 |
| 1372.0 | 0.52 |
| 1371.0 | 0.527 |
| 1370.0 | 0.535 |
| 1369.0 | 0.543 |
| 1368.0 | 0.556 |
| 1367.0 | 0.563 |
| 1366.0 | 0.571 |
| 1365.0 | 0.583 |
| 1364.0 | 0.592 |
| 1363.0 | 0.602 |
| 1362.0 | 0.617 |
| 1361.0 | 0.624 |
| 1360.0 | 0.637 |
| 1359.0 | 0.649 |
| 1358.0 | 0.662 |
| 1357.0 | 0.673 |
| 1356.0 | 0.687 |
| 1355.0 | 0.702 |
| 1354.0 | 0.715 |
| 1353.0 | 0.73 |
| 1352.0 | 0.747 |
| 1351.0 | 0.758 |
| 1350.0 | 0.773 |
| 1349.0 | 0.789 |
| 1348.0 | 0.802 |
| 1347.0 | 0.821 |
| 1346.0 | 0.838 |
| 1345.0 | 0.852 |
| 1344.0 | 0.864 |
| 1343.0 | 0.882 |
| 1342.0 | 0.897 |
| 1341.0 | 0.912 |
| 1340.0 | 0.928 |
| 1339.0 | 0.944 |
| 1338.0 | 0.955 |
| 1337.0 | 0.972 |
| 1336.0 | 0.985 |
| 1335.0 | 0.999 |
| 1334.0 | 1.01 |
| 1333.0 | 1.025 |
| 1332.0 | 1.033 |
| 1331.0 | 1.046 |
| 1330.0 | 1.056 |
| 1329.0 | 1.065 |
| 1328.0 | 1.073 |
| 1327.0 | 1.081 |
| 1326.0 | 1.087 |
| 1325.0 | 1.092 |
| 1324.0 | 1.097 |
| 1323.0 | 1.102 |
| 1322.0 | 1.102 |
| 1321.0 | 1.105 |
| 1320.0 | 1.107 |
| 1319.0 | 1.105 |
| 1318.0 | 1.105 |
| 1317.0 | 1.1 |
| 1316.0 | 1.101 |
| 1315.0 | 1.096 |
| 1314.0 | 1.092 |
| 1313.0 | 1.084 |
| 1312.0 | 1.078 |
| 1311.0 | 1.071 |
| 1310.0 | 1.063 |
| 1309.0 | 1.054 |
| 1308.0 | 1.049 |
| 1307.0 | 1.039 |
| 1306.0 | 1.028 |
| 1305.0 | 1.015 |
| 1304.0 | 1.007 |
| 1303.0 | 0.996 |
| 1302.0 | 0.985 |
| 1301.0 | 0.976 |
| 1300.0 | 0.963 |
| 1299.0 | 0.953 |
| 1298.0 | 0.941 |
| 1297.0 | 0.929 |
| 1296.0 | 0.917 |
| 1295.0 | 0.902 |
| 1294.0 | 0.893 |
| 1293.0 | 0.88 |
| 1292.0 | 0.868 |
| 1291.0 | 0.854 |
| 1290.0 | 0.843 |
| 1289.0 | 0.829 |
| 1288.0 | 0.819 |
| 1287.0 | 0.807 |
| 1286.0 | 0.792 |
| 1285.0 | 0.779 |
| 1284.0 | 0.767 |
| 1283.0 | 0.755 |
| 1282.0 | 0.74 |
| 1281.0 | 0.726 |
| 1280.0 | 0.714 |
| 1279.0 | 0.699 |
| 1278.0 | 0.688 |
| 1277.0 | 0.673 |
| 1276.0 | 0.659 |
| 1275.0 | 0.646 |
| 1274.0 | 0.631 |
| 1273.0 | 0.619 |
| 1272.0 | 0.604 |
| 1271.0 | 0.593 |
| 1270.0 | 0.576 |
| 1269.0 | 0.561 |
| 1268.0 | 0.546 |
| 1267.0 | 0.535 |
| 1266.0 | 0.519 |
| 1265.0 | 0.506 |
| 1264.0 | 0.49 |
| 1263.0 | 0.477 |
| 1262.0 | 0.463 |
| 1261.0 | 0.451 |
| 1260.0 | 0.435 |
| 1259.0 | 0.422 |
| 1258.0 | 0.407 |
| 1257.0 | 0.396 |
| 1256.0 | 0.38 |
| 1255.0 | 0.369 |
| 1254.0 | 0.355 |
| 1253.0 | 0.347 |
| 1252.0 | 0.333 |
| 1251.0 | 0.319 |
| 1250.0 | 0.31 |
| 1249.0 | 0.297 |
| 1248.0 | 0.287 |
| 1247.0 | 0.277 |
| 1246.0 | 0.27 |
| 1245.0 | 0.258 |
| 1244.0 | 0.248 |
| 1243.0 | 0.242 |
| 1242.0 | 0.233 |
| 1241.0 | 0.221 |
| 1240.0 | 0.216 |
| 1239.0 | 0.207 |
| 1238.0 | 0.201 |
| 1237.0 | 0.195 |
| 1236.0 | 0.187 |
| 1235.0 | 0.18 |
| 1234.0 | 0.174 |
| 1233.0 | 0.169 |
| 1232.0 | 0.164 |
| 1231.0 | 0.157 |
| 1230.0 | 0.153 |
| 1229.0 | 0.15 |
| 1228.0 | 0.147 |
| 1227.0 | 0.139 |
| 1226.0 | 0.137 |
| 1225.0 | 0.132 |
| 1224.0 | 0.129 |
| 1223.0 | 0.124 |
| 1222.0 | 0.122 |
| 1221.0 | 0.12 |
| 1220.0 | 0.116 |
| 1219.0 | 0.114 |
| 1218.0 | 0.111 |
| 1217.0 | 0.107 |
| 1216.0 | 0.108 |
| 1215.0 | 0.104 |
| 1214.0 | 0.101 |
| 1213.0 | 0.099 |
| 1212.0 | 0.1 |
| 1211.0 | 0.096 |
| 1210.0 | 0.096 |
| 1209.0 | 0.092 |
| 1208.0 | 0.092 |
| 1207.0 | 0.09 |
| 1206.0 | 0.089 |
| 1205.0 | 0.089 |
| 1204.0 | 0.088 |
| 1203.0 | 0.087 |
| 1202.0 | 0.087 |
| 1201.0 | 0.084 |
| 1200.0 | 0.085 |
| 1199.0 | 0.088 |
| 1198.0 | 0.088 |
| 1197.0 | 0.086 |
| 1196.0 | 0.085 |
| 1195.0 | 0.084 |
| 1194.0 | 0.083 |
| 1193.0 | 0.084 |
| 1192.0 | 0.085 |
| 1191.0 | 0.085 |
| 1190.0 | 0.086 |
| 1189.0 | 0.084 |
| 1188.0 | 0.084 |
| 1187.0 | 0.086 |
| 1186.0 | 0.088 |
| 1185.0 | 0.088 |
| 1184.0 | 0.088 |
| 1183.0 | 0.089 |
| 1182.0 | 0.091 |
| 1181.0 | 0.091 |
| 1180.0 | 0.094 |
| 1179.0 | 0.092 |
| 1178.0 | 0.098 |
| 1177.0 | 0.096 |
| 1176.0 | 0.098 |
| 1175.0 | 0.099 |
| 1174.0 | 0.099 |
| 1173.0 | 0.101 |
| 1172.0 | 0.099 |
| 1171.0 | 0.101 |
| 1170.0 | 0.103 |
| 1169.0 | 0.102 |
| 1168.0 | 0.103 |
| 1167.0 | 0.1 |
| 1166.0 | 0.101 |
| 1165.0 | 0.1 |
| 1164.0 | 0.096 |
| 1163.0 | 0.095 |
| 1162.0 | 0.094 |
| 1161.0 | 0.091 |
| 1160.0 | 0.088 |
| 1159.0 | 0.085 |
| 1158.0 | 0.082 |
| 1157.0 | 0.078 |
| 1156.0 | 0.073 |
| 1155.0 | 0.068 |
| 1154.0 | 0.066 |
| 1153.0 | 0.065 |
| 1152.0 | 0.06 |
| 1151.0 | 0.056 |
| 1150.0 | 0.053 |
| 1149.0 | 0.05 |
| 1148.0 | 0.051 |
| 1147.0 | 0.046 |
| 1146.0 | 0.043 |
| 1145.0 | 0.041 |
| 1144.0 | 0.042 |
| 1143.0 | 0.036 |
| 1142.0 | 0.034 |
| 1141.0 | 0.035 |
| 1140.0 | 0.034 |
| 1139.0 | 0.031 |
| 1138.0 | 0.029 |
| 1137.0 | 0.03 |
| 1136.0 | 0.031 |
| 1135.0 | 0.029 |
| 1134.0 | 0.025 |
| 1133.0 | 0.027 |
| 1132.0 | 0.025 |
| 1131.0 | 0.026 |
| 1130.0 | 0.025 |
| 1129.0 | 0.024 |
| 1128.0 | 0.021 |
| 1127.0 | 0.024 |
| 1126.0 | 0.022 |
| 1125.0 | 0.021 |
| 1124.0 | 0.022 |
| 1123.0 | 0.023 |
| 1122.0 | 0.022 |
| 1121.0 | 0.019 |
| 1120.0 | 0.022 |
| 1119.0 | 0.02 |
| 1118.0 | 0.022 |
| 1117.0 | 0.02 |
| 1116.0 | 0.02 |
| 1115.0 | 0.02 |
| 1114.0 | 0.019 |
| 1113.0 | 0.02 |
| 1112.0 | 0.022 |
| 1111.0 | 0.02 |
| 1110.0 | 0.019 |
| 1109.0 | 0.018 |
| 1108.0 | 0.018 |
| 1107.0 | 0.021 |
| 1106.0 | 0.018 |
| 1105.0 | 0.017 |
| 1104.0 | 0.017 |
| 1103.0 | 0.019 |
| 1102.0 | 0.018 |
| 1101.0 | 0.019 |
| 1100.0 | 0.02 |
| 1099.0 | 0.02 |
| 1098.0 | 0.02 |
| 1097.0 | 0.019 |
| 1096.0 | 0.017 |
| 1095.0 | 0.017 |
| 1094.0 | 0.02 |
| 1093.0 | 0.017 |
| 1092.0 | 0.02 |
| 1091.0 | 0.018 |
| 1090.0 | 0.019 |
| 1089.0 | 0.018 |
| 1088.0 | 0.019 |
| 1087.0 | 0.017 |
| 1086.0 | 0.019 |
| 1085.0 | 0.019 |
| 1084.0 | 0.018 |
| 1083.0 | 0.02 |
| 1082.0 | 0.019 |
| 1081.0 | 0.017 |
| 1080.0 | 0.018 |
| 1079.0 | 0.02 |
| 1078.0 | 0.017 |
| 1077.0 | 0.021 |
| 1076.0 | 0.02 |
| 1075.0 | 0.018 |
| 1074.0 | 0.023 |
| 1073.0 | 0.021 |
| 1072.0 | 0.02 |
| 1071.0 | 0.02 |
| 1070.0 | 0.022 |
| 1069.0 | 0.02 |
| 1068.0 | 0.023 |
| 1067.0 | 0.021 |
| 1066.0 | 0.021 |
| 1065.0 | 0.023 |
| 1064.0 | 0.019 |
| 1063.0 | 0.019 |
| 1062.0 | 0.02 |
| 1061.0 | 0.019 |
| 1060.0 | 0.021 |
| 1059.0 | 0.021 |
| 1058.0 | 0.02 |
| 1057.0 | 0.017 |
| 1056.0 | 0.02 |
| 1055.0 | 0.017 |
| 1054.0 | 0.017 |
| 1053.0 | 0.018 |
| 1052.0 | 0.017 |
| 1051.0 | 0.016 |
| 1050.0 | 0.019 |
| 1049.0 | 0.017 |
| 1048.0 | 0.016 |
| 1047.0 | 0.017 |
| 1046.0 | 0.017 |
| 1045.0 | 0.016 |
| 1044.0 | 0.017 |
| 1043.0 | 0.016 |
| 1042.0 | 0.016 |
| 1041.0 | 0.016 |
| 1040.0 | 0.016 |
| 1039.0 | 0.016 |
| 1038.0 | 0.014 |
| 1037.0 | 0.018 |
| 1036.0 | 0.017 |
| 1035.0 | 0.013 |
| 1034.0 | 0.014 |
| 1033.0 | 0.015 |
| 1032.0 | 0.015 |
| 1031.0 | 0.016 |
| 1030.0 | 0.015 |
| 1029.0 | 0.016 |
| 1028.0 | 0.017 |
| 1027.0 | 0.014 |
| 1026.0 | 0.015 |
| 1025.0 | 0.018 |
| 1024.0 | 0.015 |
| 1023.0 | 0.019 |
| 1022.0 | 0.014 |
| 1021.0 | 0.015 |
| 1020.0 | 0.018 |
| 1019.0 | 0.018 |
| 1018.0 | 0.016 |
| 1017.0 | 0.016 |
| 1016.0 | 0.013 |
| 1015.0 | 0.016 |
| 1014.0 | 0.015 |
| 1013.0 | 0.016 |
| 1012.0 | 0.015 |
| 1011.0 | 0.016 |
| 1010.0 | 0.016 |
| 1009.0 | 0.016 |
| 1008.0 | 0.017 |
| 1007.0 | 0.017 |
| 1006.0 | 0.017 |
| 1005.0 | 0.016 |
| 1004.0 | 0.018 |
| 1003.0 | 0.016 |
| 1002.0 | 0.017 |
| 1001.0 | 0.015 |
| 1000.0 | 0.016 |
| 999.0 | 0.015 |
| 998.0 | 0.014 |
| 997.0 | 0.015 |
| 996.0 | 0.017 |
| 995.0 | 0.017 |
| 994.0 | 0.015 |
| 993.0 | 0.015 |
| 992.0 | 0.02 |
| 991.0 | 0.017 |
| 990.0 | 0.015 |
| 989.0 | 0.017 |
| 988.0 | 0.016 |
| 987.0 | 0.016 |
| 986.0 | 0.013 |
| 985.0 | 0.017 |
| 984.0 | 0.016 |
| 983.0 | 0.014 |
| 982.0 | 0.015 |
| 981.0 | 0.016 |
| 980.0 | 0.014 |
| 979.0 | 0.015 |
| 978.0 | 0.015 |
| 977.0 | 0.017 |
| 976.0 | 0.014 |
| 975.0 | 0.015 |
| 974.0 | 0.015 |
| 973.0 | 0.015 |
| 972.0 | 0.017 |
| 971.0 | 0.016 |
| 970.0 | 0.015 |
| 969.0 | 0.015 |
| 968.0 | 0.015 |
| 967.0 | 0.017 |
| 966.0 | 0.012 |
| 965.0 | 0.018 |
| 964.0 | 0.015 |
| 963.0 | 0.016 |
| 962.0 | 0.016 |
| 961.0 | 0.014 |
| 960.0 | 0.015 |
| 959.0 | 0.014 |
| 958.0 | 0.015 |
| 957.0 | 0.014 |
| 956.0 | 0.014 |
| 955.0 | 0.013 |
| 954.0 | 0.015 |
| 953.0 | 0.017 |
| 952.0 | 0.015 |
| 951.0 | 0.016 |
| 950.0 | 0.015 |
| 949.0 | 0.014 |
| 948.0 | 0.017 |
| 947.0 | 0.017 |
| 946.0 | 0.017 |
| 945.0 | 0.013 |
| 944.0 | 0.018 |
| 943.0 | 0.012 |
| 942.0 | 0.015 |
| 941.0 | 0.016 |
| 940.0 | 0.016 |
| 939.0 | 0.017 |
| 938.0 | 0.016 |
| 937.0 | 0.015 |
| 936.0 | 0.016 |
| 935.0 | 0.016 |
| 934.0 | 0.017 |
| 933.0 | 0.015 |
| 932.0 | 0.013 |
| 931.0 | 0.014 |
| 930.0 | 0.015 |
| 929.0 | 0.015 |
| 928.0 | 0.014 |
| 927.0 | 0.014 |
| 926.0 | 0.012 |
| 925.0 | 0.017 |
| 924.0 | 0.013 |
| 923.0 | 0.016 |
| 922.0 | 0.013 |
| 921.0 | 0.015 |
| 920.0 | 0.016 |
| 919.0 | 0.016 |
| 918.0 | 0.015 |
| 917.0 | 0.017 |
| 916.0 | 0.013 |
| 915.0 | 0.017 |
| 914.0 | 0.015 |
| 913.0 | 0.015 |
| 912.0 | 0.015 |
| 911.0 | 0.015 |
| 910.0 | 0.014 |
| 909.0 | 0.017 |
| 908.0 | 0.016 |
| 907.0 | 0.015 |
| 906.0 | 0.015 |
| 905.0 | 0.017 |
| 904.0 | 0.013 |
| 903.0 | 0.012 |
| 902.0 | 0.013 |
| 901.0 | 0.017 |
| 900.0 | 0.013 |
| 899.0 | 0.017 |
| 898.0 | 0.016 |
| 897.0 | 0.015 |
| 896.0 | 0.015 |
| 895.0 | 0.015 |
| 894.0 | 0.016 |
| 893.0 | 0.014 |
| 892.0 | 0.015 |
| 891.0 | 0.016 |
| 890.0 | 0.015 |
| 889.0 | 0.015 |
| 888.0 | 0.015 |
| 887.0 | 0.014 |
| 886.0 | 0.017 |
| 885.0 | 0.018 |
| 884.0 | 0.016 |
| 883.0 | 0.016 |
| 882.0 | 0.015 |
| 881.0 | 0.014 |
| 880.0 | 0.016 |
| 879.0 | 0.017 |
| 878.0 | 0.016 |
| 877.0 | 0.016 |
| 876.0 | 0.016 |
| 875.0 | 0.018 |
| 874.0 | 0.014 |
| 873.0 | 0.016 |
| 872.0 | 0.016 |
| 871.0 | 0.015 |
| 870.0 | 0.014 |
| 869.0 | 0.016 |
| 868.0 | 0.016 |
| 867.0 | 0.017 |
| 866.0 | 0.018 |
| 865.0 | 0.016 |
| 864.0 | 0.018 |
| 863.0 | 0.018 |
| 862.0 | 0.015 |
| 861.0 | 0.014 |
| 860.0 | 0.014 |
| 859.0 | 0.015 |
| 858.0 | 0.015 |
| 857.0 | 0.014 |
| 856.0 | 0.017 |
| 855.0 | 0.016 |
| 854.0 | 0.014 |
| 853.0 | 0.017 |
| 852.0 | 0.014 |
| 851.0 | 0.015 |
| 850.0 | 0.014 |
| 849.0 | 0.015 |
| 848.0 | 0.018 |
| 847.0 | 0.017 |
| 846.0 | 0.013 |
| 845.0 | 0.015 |
| 844.0 | 0.016 |
| 843.0 | 0.015 |
| 842.0 | 0.011 |
| 841.0 | 0.016 |
| 840.0 | 0.014 |
| 839.0 | 0.016 |
| 838.0 | 0.015 |
| 837.0 | 0.015 |
| 836.0 | 0.016 |
| 835.0 | 0.017 |
| 834.0 | 0.016 |
| 833.0 | 0.016 |
| 832.0 | 0.016 |
| 831.0 | 0.017 |
| 830.0 | 0.013 |
| 829.0 | 0.017 |
| 828.0 | 0.016 |
| 827.0 | 0.017 |
| 826.0 | 0.017 |
| 825.0 | 0.018 |
| 824.0 | 0.014 |
| 823.0 | 0.014 |
| 822.0 | 0.017 |
| 821.0 | 0.016 |
| 820.0 | 0.017 |
| 819.0 | 0.014 |
| 818.0 | 0.015 |
| 817.0 | 0.016 |
| 816.0 | 0.016 |
| 815.0 | 0.016 |
| 814.0 | 0.016 |
| 813.0 | 0.018 |
| 812.0 | 0.016 |
| 811.0 | 0.016 |
| 810.0 | 0.015 |
| 809.0 | 0.015 |
| 808.0 | 0.015 |
| 807.0 | 0.012 |
| 806.0 | 0.014 |
| 805.0 | 0.016 |
| 804.0 | 0.015 |
| 803.0 | 0.015 |
| 802.0 | 0.016 |
| 801.0 | 0.016 |
| 800.0 | 0.017 |
| 799.0 | 0.001 |
| 798.0 | 0.001 |
| 797.0 | 0.001 |
| 796.0 | 0.001 |
| 795.0 | 0.001 |
| 794.0 | 0.002 |
| 793.0 | 0.001 |
| 792.0 | 0.001 |
| 791.0 | 0.001 |
| 790.0 | 0.001 |
| 789.0 | 0.001 |
| 788.0 | 0.001 |
| 787.0 | 0.001 |
| 786.0 | 0.001 |
| 785.0 | 0.001 |
| 784.0 | 0.001 |
| 783.0 | 0.001 |
| 782.0 | 0.001 |
| 781.0 | 0.001 |
| 780.0 | 0.001 |
| 779.0 | 0.001 |
| 778.0 | 0.001 |
| 777.0 | 0.001 |
| 776.0 | 0.001 |
| 775.0 | 0.001 |
| 774.0 | 0.001 |
| 773.0 | 0.001 |
| 772.0 | 0.001 |
| 771.0 | 0.001 |
| 770.0 | 0.001 |
| 769.0 | 0 |
| 768.0 | 0.001 |
| 767.0 | 0 |
| 766.0 | 0.001 |
| 765.0 | 0 |
| 764.0 | 0 |
| 763.0 | 0 |
| 762.0 | 0 |
| 761.0 | 0 |
| 760.0 | 0 |
| 759.0 | 0 |
| 758.0 | 0 |
| 757.0 | 0 |
| 756.0 | 0 |
| 755.0 | 0 |
| 754.0 | 0 |
| 753.0 | 0 |
| 752.0 | 0 |
| 751.0 | 0 |
| 750.0 | 0 |
| 749.0 | 0 |
| 748.0 | 0 |
| 747.0 | 0 |
| 746.0 | 0 |
| 745.0 | 0 |
| 744.0 | 0 |
| 743.0 | 0 |
| 742.0 | 0 |
| 741.0 | 0 |
| 740.0 | 0 |
| 739.0 | 0 |
| 738.0 | 0 |
| 737.0 | 0 |
| 736.0 | 0 |
| 735.0 | 0 |
| 734.0 | 0 |
| 733.0 | 0 |
| 732.0 | 0 |
| 731.0 | 0 |
| 730.0 | 0 |
| 729.0 | 0 |
| 728.0 | 0 |
| 727.0 | 0 |
| 726.0 | 0 |
| 725.0 | 0 |
| 724.0 | 0 |
| 723.0 | 0 |
| 722.0 | 0 |
| 721.0 | 0 |
| 720.0 | 0 |
| 719.0 | 0 |
| 718.0 | 0 |
| 717.0 | 0 |
| 716.0 | 0 |
| 715.0 | 0 |
| 714.0 | 0 |
| 713.0 | 0 |
| 712.0 | 0 |
| 711.0 | 0 |
| 710.0 | 0 |
| 709.0 | 0 |
| 708.0 | 0 |
| 707.0 | 0 |
| 706.0 | 0 |
| 705.0 | 0 |
| 704.0 | 0 |
| 703.0 | 0 |
| 702.0 | 0 |
| 701.0 | 0 |
| 700.0 | 0 |
| 699.0 | 0 |
| 698.0 | 0 |
| 697.0 | 0 |
| 696.0 | 0 |
| 695.0 | 0 |
| 694.0 | 0 |
| 693.0 | 0 |
| 692.0 | 0 |
| 691.0 | 0 |
| 690.0 | 0 |
| 689.0 | 0 |
| 688.0 | 0 |
| 687.0 | 0 |
| 686.0 | 0 |
| 685.0 | 0 |
| 684.0 | 0 |
| 683.0 | 0 |
| 682.0 | 0 |
| 681.0 | 0 |
| 680.0 | 0 |
| 679.0 | 0 |
| 678.0 | 0 |
| 677.0 | 0 |
| 676.0 | 0 |
| 675.0 | 0 |
| 674.0 | 0 |
| 673.0 | 0 |
| 672.0 | 0 |
| 671.0 | 0 |
| 670.0 | 0 |
| 669.0 | 0 |
| 668.0 | 0 |
| 667.0 | 0 |
| 666.0 | 0 |
| 665.0 | 0 |
| 664.0 | 0 |
| 663.0 | 0 |
| 662.0 | 0 |
| 661.0 | 0 |
| 660.0 | 0 |
| 659.0 | 0 |
| 658.0 | 0 |
| 657.0 | 0 |
| 656.0 | 0 |
| 655.0 | 0 |
| 654.0 | 0 |
| 653.0 | 0 |
| 652.0 | 0 |
| 651.0 | 0 |
| 650.0 | 0 |
| 649.0 | 0 |
| 648.0 | 0 |
| 647.0 | 0 |
| 646.0 | 0 |
| 645.0 | 0 |
| 644.0 | 0 |
| 643.0 | 0 |
| 642.0 | 0 |
| 641.0 | 0 |
| 640.0 | 0 |
| 639.0 | 0 |
| 638.0 | 0 |
| 637.0 | 0 |
| 636.0 | 0 |
| 635.0 | 0 |
| 634.0 | 0 |
| 633.0 | 0 |
| 632.0 | 0 |
| 631.0 | 0 |
| 630.0 | 0 |
| 629.0 | 0 |
| 628.0 | 0 |
| 627.0 | 0 |
| 626.0 | 0 |
| 625.0 | 0 |
| 624.0 | 0 |
| 623.0 | 0 |
| 622.0 | 0 |
| 621.0 | 0 |
| 620.0 | 0 |
| 619.0 | 0 |
| 618.0 | 0 |
| 617.0 | 0 |
| 616.0 | 0 |
| 615.0 | 0 |
| 614.0 | 0 |
| 613.0 | 0 |
| 612.0 | 0 |
| 611.0 | 0 |
| 610.0 | 0 |
| 609.0 | 0 |
| 608.0 | 0 |
| 607.0 | 0 |
| 606.0 | 0 |
| 605.0 | 0 |
| 604.0 | 0 |
| 603.0 | 0 |
| 602.0 | 0 |
| 601.0 | 0 |
| 600.0 | 0 |
| 599.0 | 0 |
| 598.0 | 0 |
| 597.0 | 0 |
| 596.0 | 0 |
| 595.0 | 0 |
| 594.0 | 0 |
| 593.0 | 0 |
| 592.0 | 0 |
| 591.0 | 0 |
| 590.0 | 0 |
| 589.0 | 0 |
| 588.0 | 0 |
| 587.0 | 0 |
| 586.0 | 0 |
| 585.0 | 0 |
| 584.0 | 0 |
| 583.0 | 0 |
| 582.0 | 0 |
| 581.0 | 0.001 |
| 580.0 | 0.001 |
| 579.0 | 0.001 |
| 578.0 | 0.001 |
| 577.0 | 0.001 |
| 576.0 | 0.001 |
| 575.0 | 0.001 |
| 574.0 | 0.001 |
| 573.0 | 0.001 |
| 572.0 | 0.001 |
| 571.0 | 0.001 |
| 570.0 | 0.001 |
| 569.0 | 0.002 |
| 568.0 | 0.002 |
| 567.0 | 0.002 |
| 566.0 | 0.002 |
| 565.0 | 0.002 |
| 564.0 | 0.002 |
| 563.0 | 0.002 |
| 562.0 | 0.002 |
| 561.0 | 0.003 |
| 560.0 | 0.003 |
| 559.0 | 0.003 |
| 558.0 | 0.003 |
| 557.0 | 0.004 |
| 556.0 | 0.005 |
| 555.0 | 0.005 |
| 554.0 | 0.006 |
| 553.0 | 0.007 |
| 552.0 | 0.008 |
| 551.0 | 0.01 |
| 550.0 | 0.012 |
| 549.0 | 0.014 |
| 548.0 | 0.018 |
| 547.0 | 0.023 |
| 546.0 | 0.029 |
| 545.0 | 0.038 |
| 544.0 | 0.052 |
| 543.0 | 0.073 |
| 542.0 | 0.106 |
| 541.0 | 0.162 |
| 540.0 | 0.265 |
| 539.0 | 0.468 |
| 538.0 | 0.932 |
| 537.0 | 2.179 |
| 536.0 | 6.195 |
| 535.0 | 18.357 |
| 534.0 | 40.41 |
| 533.0 | 60.304 |
| 532.0 | 61.207 |
| 531.0 | 42.614 |
| 530.0 | 19.941 |
| 529.0 | 6.677 |
| 528.0 | 2.182 |
| 527.0 | 0.865 |
| 526.0 | 0.407 |
| 525.0 | 0.216 |
| 524.0 | 0.125 |
| 523.0 | 0.078 |
| 522.0 | 0.051 |
| 521.0 | 0.035 |
| 520.0 | 0.024 |
| 519.0 | 0.018 |
| 518.0 | 0.013 |
| 517.0 | 0.01 |
| 516.0 | 0.008 |
| 515.0 | 0.006 |
| 514.0 | 0.005 |
| 513.0 | 0.004 |
| 512.0 | 0.003 |
| 511.0 | 0.003 |
| 510.0 | 0.002 |
| 509.0 | 0.002 |
| 508.0 | 0.002 |
| 507.0 | 0.001 |
| 506.0 | 0.001 |
| 505.0 | 0.001 |
| 504.0 | 0.001 |
| 503.0 | 0.001 |
| 502.0 | 0.001 |
| 501.0 | 0.001 |
| 500.0 | 0.001 |
| 499.0 | 0.001 |
| 498.0 | 0.001 |
| 497.0 | 0 |
| 496.0 | 0 |
| 495.0 | 0 |
| 494.0 | 0.001 |
| 493.0 | 0 |
| 492.0 | 0 |
| 491.0 | 0 |
| 490.0 | 0 |
| 489.0 | 0 |
| 488.0 | 0 |
| 487.0 | 0 |
| 486.0 | 0 |
| 485.0 | 0 |
| 484.0 | 0 |
| 483.0 | 0 |
| 482.0 | 0 |
| 481.0 | 0 |
| 480.0 | 0 |
| 479.0 | 0 |
| 478.0 | 0 |
| 477.0 | 0 |
| 476.0 | 0 |
| 475.0 | 0 |
| 474.0 | 0 |
| 473.0 | 0 |
| 472.0 | 0 |
| 471.0 | 0 |
| 470.0 | 0 |
| 469.0 | 0 |
| 468.0 | 0 |
| 467.0 | 0 |
| 466.0 | 0 |
| 465.0 | 0 |
| 464.0 | 0 |
| 463.0 | 0 |
| 462.0 | 0 |
| 461.0 | 0 |
| 460.0 | 0 |
| 459.0 | 0 |
| 458.0 | 0 |
| 457.0 | 0 |
| 456.0 | 0 |
| 455.0 | 0 |
| 454.0 | 0 |
| 453.0 | 0 |
| 452.0 | 0 |
| 451.0 | 0 |
| 450.0 | 0 |
| 449.0 | 0 |
| 448.0 | 0 |
| 447.0 | 0 |
| 446.0 | 0 |
| 445.0 | 0 |
| 444.0 | 0 |
| 443.0 | 0 |
| 442.0 | 0 |
| 441.0 | 0 |
| 440.0 | 0 |
| 439.0 | 0 |
| 438.0 | 0 |
| 437.0 | 0 |
| 436.0 | 0 |
| 435.0 | 0 |
| 434.0 | 0 |
| 433.0 | 0 |
| 432.0 | 0 |
| 431.0 | 0 |
| 430.0 | 0 |
| 429.0 | 0 |
| 428.0 | 0 |
| 427.0 | 0 |
| 426.0 | 0 |
| 425.0 | 0 |
| 424.0 | 0 |
| 423.0 | 0 |
| 422.0 | 0 |
| 421.0 | 0 |
| 420.0 | 0 |
| 419.0 | 0 |
| 418.0 | 0.001 |
| 417.0 | 0.001 |
| 416.0 | 0 |
| 415.0 | 0 |
| 414.0 | 0 |
| 413.0 | 0 |
| 412.0 | 0 |
| 411.0 | 0.001 |
| 410.0 | 0.002 |
| 409.0 | 0.003 |
| 408.0 | 0.004 |
| 407.0 | 0.006 |
| 406.0 | 0.008 |
| 405.0 | 0.008 |
| 404.0 | 0.008 |
| 403.0 | 0.007 |
| 402.0 | 0.005 |
| 401.0 | 0.004 |
| 400.0 | 0.003 |
| 399.0 | 0.003 |
| 398.0 | 0.003 |
| 397.0 | 0.003 |
| 396.0 | 0.002 |
| 395.0 | 0.002 |
| 394.0 | 0.001 |
| 393.0 | 0.001 |
| 392.0 | 0 |
| 391.0 | 0.001 |
| 390.0 | 0.001 |
| 389.0 | 0.001 |
| 388.0 | 0 |
| 387.0 | 0 |
| 386.0 | 0 |
| 385.0 | 0 |
| 384.0 | 0 |
| 383.0 | 0 |
| 382.0 | 0 |
| 381.0 | 0 |
| 380.0 | 0 |
| 379.0 | 0 |
| 378.0 | 0 |
| 377.0 | 0 |
| 376.0 | 0 |
| 375.0 | 0 |
| 374.0 | 0 |
| 373.0 | 0 |
| 372.0 | 0 |
| 371.0 | 0 |
| 370.0 | 0 |
| 369.0 | 0 |
| 368.0 | 0 |
| 367.0 | 0 |
| 366.0 | 0 |
| 365.0 | 0 |
| 364.0 | 0 |
| 363.0 | 0 |
| 362.0 | 0 |
| 361.0 | 0 |
| 360.0 | 0 |
| 359.0 | 0 |
| 358.0 | 0 |
| 357.0 | 0 |
| 356.0 | 0 |
| 355.0 | 0 |
| 354.0 | 0 |
| 353.0 | 0 |
| 352.0 | 0 |
| 351.0 | 0 |
| 350.0 | 0 |
| 349.0 | 0.001 |
| 348.0 | 0 |
| 347.0 | 0 |
| 346.0 | 0 |
| 345.0 | 0 |
| 344.0 | 0 |
| 343.0 | 0 |
| 342.0 | 0 |
| 341.0 | 0 |
| 340.0 | 0 |
| 339.0 | 0 |
| 338.0 | 0 |
| 337.0 | 0 |
| 336.0 | 0 |
| 335.0 | 0 |
| 334.0 | 0 |
| 333.0 | 0 |
| 332.0 | 0 |
| 331.0 | 0 |
| 330.0 | 0 |
| 329.0 | 0 |
| 328.0 | 0 |
| 327.0 | 0 |
| 326.0 | 0 |
| 325.0 | 0 |
| 324.0 | 0 |
| 323.0 | 0 |
| 322.0 | 0 |
| 321.0 | 0 |
| 320.0 | 0 |
| 319.0 | 0 |
| 318.0 | 0 |
| 317.0 | 0 |
| 316.0 | 0 |
| 315.0 | 0 |
| 314.0 | 0 |
| 313.0 | 0 |
| 312.0 | 0 |
| 311.0 | 0 |
| 310.0 | 0 |
| 309.0 | 0 |
| 308.0 | 0 |
| 307.0 | 0 |
| 306.0 | 0 |
| 305.0 | 0 |
| 304.0 | 0 |
| 303.0 | 0 |
| 302.0 | 0 |
| 301.0 | 0 |
| 300.0 | 0 |
| 299.0 | 0 |
| 298.0 | 0 |
| 297.0 | 0 |
| 296.0 | 0 |
| 295.0 | 0 |
| 294.0 | 0 |
| 293.0 | 0 |
| 292.0 | 0 |
| 291.0 | 0 |
| 290.0 | 0 |
| 289.0 | 0 |
| 288.0 | 0 |
| 287.0 | 0 |
| 286.0 | 0 |
| 285.0 | 0 |
| 284.0 | 0 |
| 283.0 | 0 |
| 282.0 | 0 |
| 281.0 | 0 |
| 280.0 | 0 |
| 279.0 | 0 |
| 278.0 | 0 |
| 277.0 | 0 |
| 276.0 | 0 |
| 275.0 | 0 |
| 274.0 | 0 |
| 273.0 | 0 |
| 272.0 | 0 |
| 271.0 | 0 |
| 270.0 | 0 |
| 269.0 | 0 |
| 268.0 | 0 |
| 267.0 | 0 |
| 266.0 | 0 |
| 265.0 | 0 |
| 264.0 | 0 |
| 263.0 | 0 |
| 262.0 | 0 |
| 261.0 | 0 |
| 260.0 | 0 |
| 259.0 | 0 |
| 258.0 | 0 |
| 257.0 | 0 |
| 256.0 | 0 |
| 255.0 | 0 |
| 254.0 | 0 |
| 253.0 | 0 |
| 252.0 | 0 |
| 251.0 | 0 |
| 250.0 | 0 |
| 249.0 | 0 |
| 248.0 | 0 |
| 247.0 | 0 |
| 246.0 | 0 |
| 245.0 | 0 |
| 244.0 | 0 |
| 243.0 | 0 |
| 242.0 | 0 |
| 241.0 | 0 |
| 240.0 | 0 |
| 239.0 | 0 |
| 238.0 | 0 |
| 237.0 | 0 |
| 236.0 | 0 |
| 235.0 | 0 |
| 234.0 | 0 |
| 233.0 | 0 |
| 232.0 | 0 |
| 231.0 | 0 |
| 230.0 | 0 |
| 229.0 | 0 |
| 228.0 | 0 |
| 227.0 | 0 |
| 226.0 | 0 |
| 225.0 | 0 |
| 224.0 | 0 |
| 223.0 | 0 |
| 222.0 | 0 |
| 221.0 | 0 |
| 220.0 | 0 |
| 219.0 | 0 |
| 218.0 | 0 |
| 217.0 | 0 |
| 216.0 | 0 |
| 215.0 | 0 |
| 214.0 | 0 |
| 213.0 | 0 |
| 212.0 | 0 |
| 211.0 | 0 |
| 210.0 | 0 |
| 209.0 | 0 |
| 208.0 | 0 |
| 207.0 | 0 |
| 206.0 | 0 |
| 205.0 | 0 |
| 204.0 | 0 |
| 203.0 | 0 |
| 202.0 | 0 |
| 201.0 | 0 |